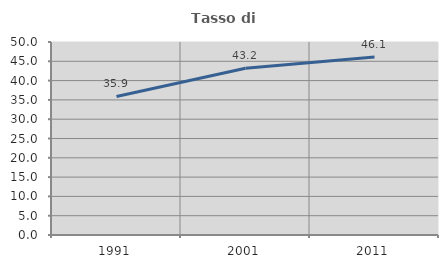
| Category | Tasso di occupazione   |
|---|---|
| 1991.0 | 35.888 |
| 2001.0 | 43.217 |
| 2011.0 | 46.14 |